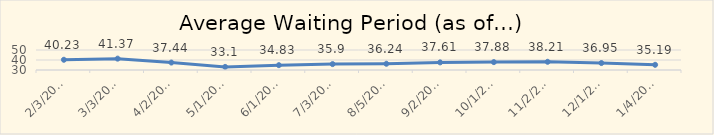
| Category | Series 0 |
|---|---|
| 2/3/20 | 40.23 |
| 3/3/20 | 41.37 |
| 4/2/20 | 37.44 |
| 5/1/20 | 33.1 |
| 6/1/20 | 34.83 |
| 7/3/20 | 35.9 |
| 8/5/20 | 36.24 |
| 9/2/20 | 37.61 |
| 10/1/20 | 37.88 |
| 11/2/20 | 38.21 |
| 12/1/20 | 36.95 |
| 1/4/20 | 35.19 |